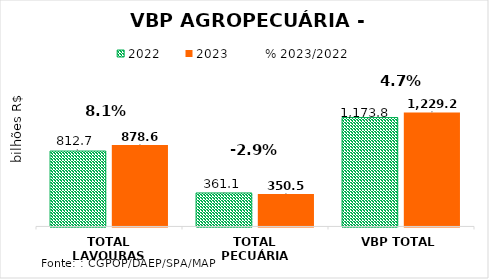
| Category | 2022 | 2023 |
|---|---|---|
| TOTAL LAVOURAS | 812.722 | 878.622 |
| TOTAL PECUÁRIA | 361.053 | 350.575 |
| VBP TOTAL | 1173.775 | 1229.198 |